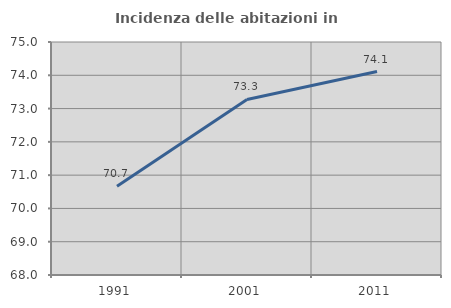
| Category | Incidenza delle abitazioni in proprietà  |
|---|---|
| 1991.0 | 70.664 |
| 2001.0 | 73.274 |
| 2011.0 | 74.113 |